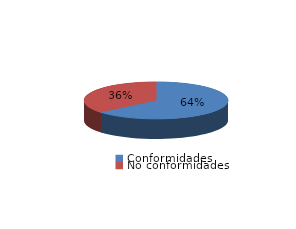
| Category | Series 0 |
|---|---|
| Conformidades | 2314 |
| No conformidades | 1314 |